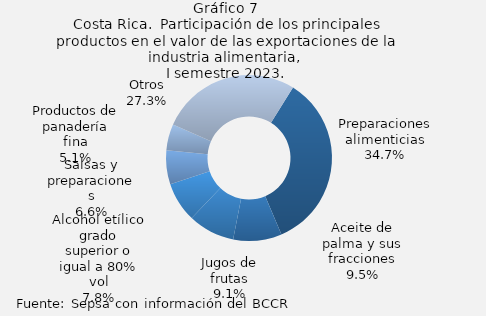
| Category | Series 0 |
|---|---|
| Preparaciones alimenticias | 34.721 |
| Aceite de palma y sus fracciones | 9.455 |
| Jugos de frutas | 9.053 |
| Alcohol etílico grado superior o igual a 80% vol | 7.758 |
| Salsas y preparaciones | 6.608 |
| Productos de panadería fina | 5.105 |
| Otros | 27.301 |